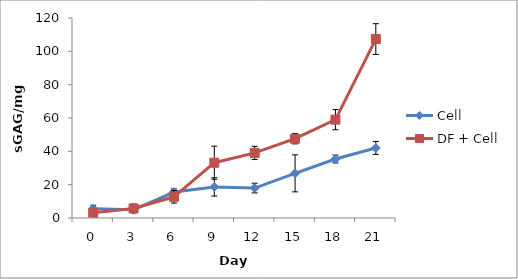
| Category | Cell | DF + Cell |
|---|---|---|
| 0.0 | 5.6 | 3.169 |
| 3.0 | 4.939 | 5.739 |
| 6.0 | 15.587 | 12.729 |
| 9.0 | 18.662 | 33.181 |
| 12.0 | 17.979 | 39.055 |
| 15.0 | 26.799 | 47.562 |
| 18.0 | 35.389 | 59.024 |
| 21.0 | 42.037 | 107.354 |